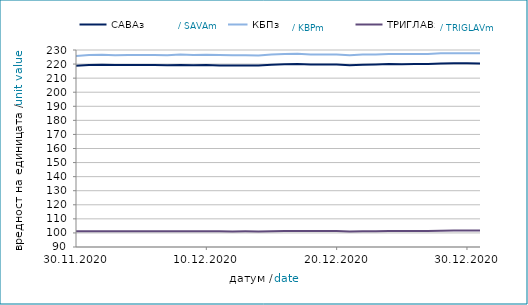
| Category | САВАз | КБПз | ТРИГЛАВз |
|---|---|---|---|
| 2020-11-30 | 218.731 | 225.818 | 101.241 |
| 2020-12-01 | 219.293 | 226.476 | 101.281 |
| 2020-12-02 | 219.562 | 226.653 | 101.251 |
| 2020-12-03 | 219.298 | 226.305 | 101.151 |
| 2020-12-04 | 219.412 | 226.524 | 101.143 |
| 2020-12-05 | 219.401 | 226.496 | 101.137 |
| 2020-12-06 | 219.414 | 226.509 | 101.141 |
| 2020-12-07 | 219.185 | 226.334 | 101.135 |
| 2020-12-08 | 219.389 | 226.728 | 101.237 |
| 2020-12-09 | 219.131 | 226.364 | 101.159 |
| 2020-12-10 | 219.256 | 226.605 | 101.181 |
| 2020-12-11 | 219.007 | 226.377 | 101.116 |
| 2020-12-12 | 218.976 | 226.328 | 101.103 |
| 2020-12-13 | 218.988 | 226.341 | 101.107 |
| 2020-12-14 | 219.044 | 226.062 | 101.102 |
| 2020-12-15 | 219.459 | 226.745 | 101.201 |
| 2020-12-16 | 219.862 | 227.07 | 101.364 |
| 2020-12-17 | 220.033 | 227.395 | 101.414 |
| 2020-12-18 | 219.673 | 226.82 | 101.297 |
| 2020-12-19 | 219.641 | 226.768 | 101.283 |
| 2020-12-20 | 219.654 | 226.781 | 101.287 |
| 2020-12-21 | 219.106 | 226.313 | 100.981 |
| 2020-12-22 | 219.477 | 226.736 | 101.277 |
| 2020-12-23 | 219.676 | 226.773 | 101.199 |
| 2020-12-24 | 220.004 | 227.226 | 101.411 |
| 2020-12-25 | 219.954 | 227.135 | 101.383 |
| 2020-12-26 | 219.965 | 227.147 | 101.386 |
| 2020-12-27 | 219.978 | 227.16 | 101.39 |
| 2020-12-28 | 220.47 | 227.689 | 101.572 |
| 2020-12-29 | 220.566 | 227.661 | 101.706 |
| 2020-12-30 | 220.524 | 227.705 | 101.665 |
| 2020-12-31 | 220.489 | 227.667 | 101.665 |